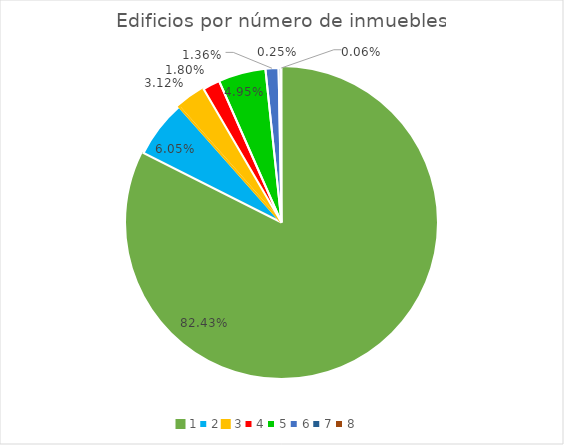
| Category | Series 0 |
|---|---|
| 0 | 0.824 |
| 1 | 0.06 |
| 2 | 0.031 |
| 3 | 0.018 |
| 4 | 0.05 |
| 5 | 0.014 |
| 6 | 0.002 |
| 7 | 0.001 |